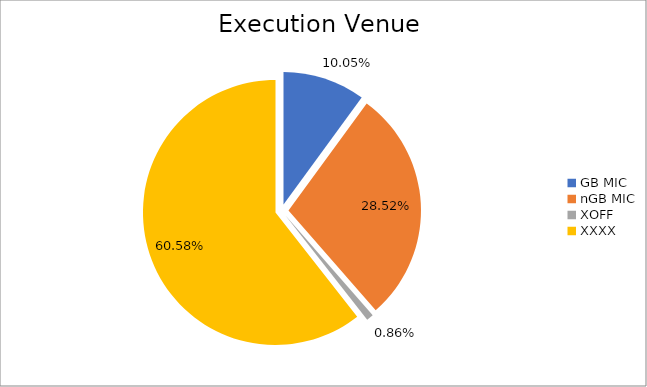
| Category | Series 0 |
|---|---|
| GB MIC | 1076692.436 |
| nGB MIC | 3057127.567 |
| XOFF | 91665.615 |
| XXXX | 6492356.014 |